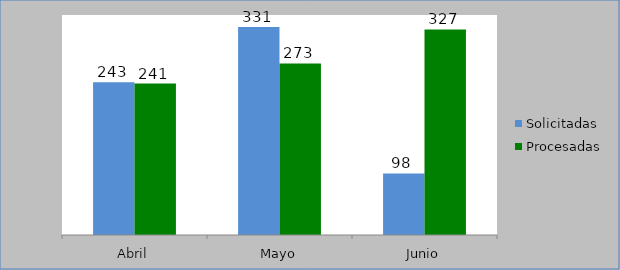
| Category | Solicitadas | Procesadas |
|---|---|---|
| Abril | 243 | 241 |
| Mayo | 331 | 273 |
| Junio | 98 | 327 |